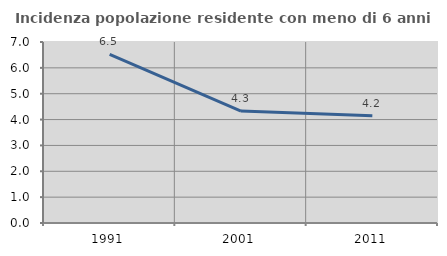
| Category | Incidenza popolazione residente con meno di 6 anni |
|---|---|
| 1991.0 | 6.525 |
| 2001.0 | 4.328 |
| 2011.0 | 4.151 |